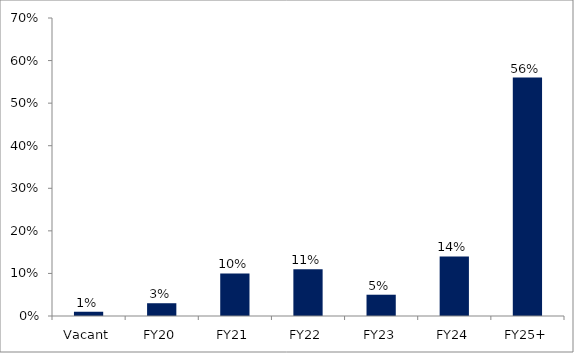
| Category | Series 0 |
|---|---|
| Vacant | 0.01 |
| FY20 | 0.03 |
| FY21 | 0.1 |
| FY22 | 0.11 |
| FY23 | 0.05 |
| FY24 | 0.14 |
| FY25+ | 0.56 |